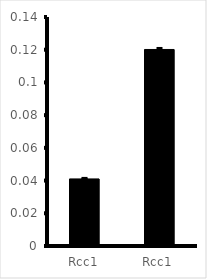
| Category | Series 0 |
|---|---|
| Rcc1 | 0.041 |
| Rcc1 | 0.12 |